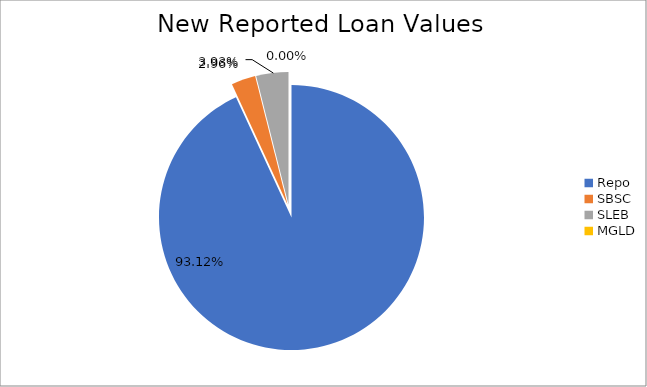
| Category | Series 0 |
|---|---|
| Repo | 9249552.556 |
| SBSC | 293611.323 |
| SLEB | 389994.701 |
| MGLD | 13.655 |